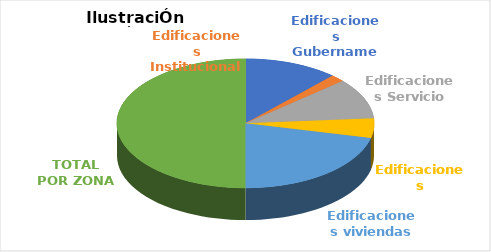
| Category | Series 0 |
|---|---|
| Edificaciones Gubernamentales | 43943.31 |
| Edificaciones Institucionales | 6709 |
| Edificaciones Servicio | 37820.07 |
| Edificaciones Recreativas | 18201.26 |
| Edificaciones viviendas | 79664.52 |
| TOTAL POR ZONA | 186338.16 |